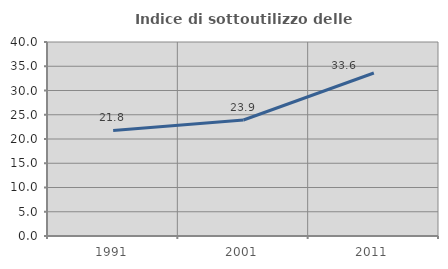
| Category | Indice di sottoutilizzo delle abitazioni  |
|---|---|
| 1991.0 | 21.764 |
| 2001.0 | 23.917 |
| 2011.0 | 33.615 |